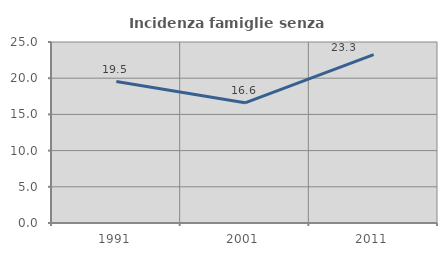
| Category | Incidenza famiglie senza nuclei |
|---|---|
| 1991.0 | 19.537 |
| 2001.0 | 16.596 |
| 2011.0 | 23.25 |